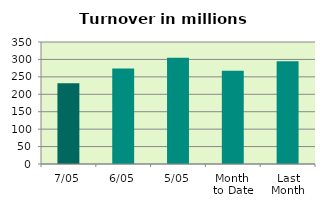
| Category | Series 0 |
|---|---|
| 7/05 | 231.389 |
| 6/05 | 273.79 |
| 5/05 | 304.587 |
| Month 
to Date | 267.504 |
| Last
Month | 294.539 |